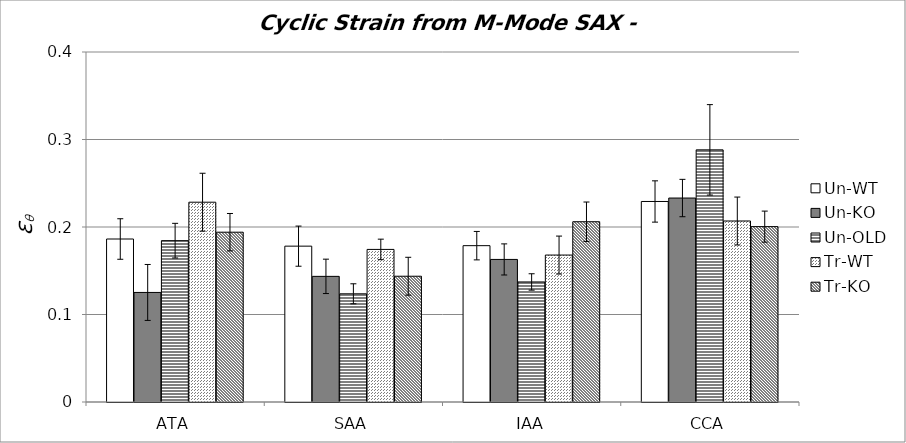
| Category | Un-WT | Un-KO | Un-OLD | Tr-WT | Tr-KO |
|---|---|---|---|---|---|
| 0 | 0.186 | 0.125 | 0.184 | 0.228 | 0.194 |
| 1 | 0.178 | 0.144 | 0.124 | 0.174 | 0.144 |
| 2 | 0.179 | 0.163 | 0.137 | 0.168 | 0.206 |
| 3 | 0.229 | 0.233 | 0.288 | 0.207 | 0.2 |